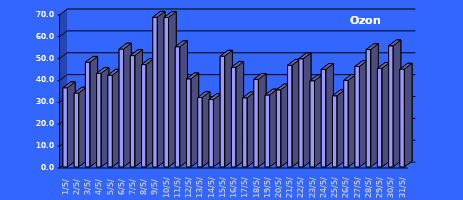
| Category | Ozon  [µg/m3] |
|---|---|
| 2023-05-01 | 36.171 |
| 2023-05-02 | 33.76 |
| 2023-05-03 | 47.826 |
| 2023-05-04 | 42.758 |
| 2023-05-05 | 41.947 |
| 2023-05-06 | 53.87 |
| 2023-05-07 | 50.868 |
| 2023-05-08 | 46.773 |
| 2023-05-09 | 68.409 |
| 2023-05-10 | 68.311 |
| 2023-05-11 | 54.911 |
| 2023-05-12 | 40.242 |
| 2023-05-13 | 31.718 |
| 2023-05-14 | 30.79 |
| 2023-05-15 | 50.621 |
| 2023-05-16 | 45.477 |
| 2023-05-17 | 31.574 |
| 2023-05-18 | 40.013 |
| 2023-05-19 | 32.876 |
| 2023-05-20 | 35.226 |
| 2023-05-21 | 46.461 |
| 2023-05-22 | 49.417 |
| 2023-05-23 | 39.371 |
| 2023-05-24 | 44.594 |
| 2023-05-25 | 32.505 |
| 2023-05-26 | 39.562 |
| 2023-05-27 | 45.89 |
| 2023-05-28 | 53.627 |
| 2023-05-29 | 45.026 |
| 2023-05-30 | 55.333 |
| 2023-05-31 | 44.714 |